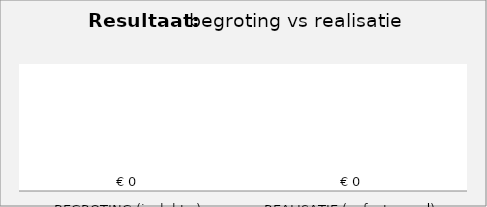
| Category | Series 0 |
|---|---|
| BEGROTING (incl. btw) | 0 |
| REALISATIE (gefactureerd) | 0 |